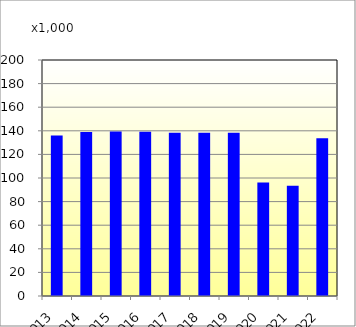
| Category | DOM | INT |
|---|---|---|
| 2013 | 136012 | 0 |
| 2014 | 139078 | 6 |
| 2015 | 139436 | 14 |
| 2016 | 139182 | 10 |
| 2017 | 138452 | 4 |
| 2018 | 138264 | 0 |
| 2019 | 138424 | 20 |
| 2020 | 96226 | 0 |
| 2021 | 93480 | 0 |
| 2022 | 133666 | 0 |